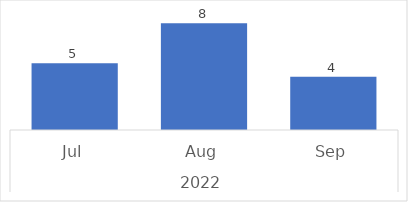
| Category | Total |
|---|---|
| 0 | 5 |
| 1 | 8 |
| 2 | 4 |